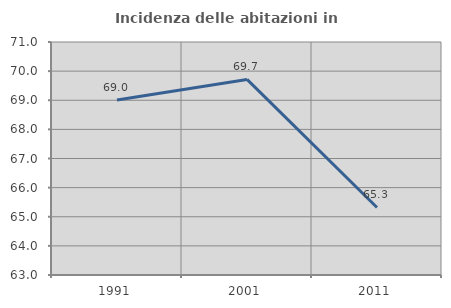
| Category | Incidenza delle abitazioni in proprietà  |
|---|---|
| 1991.0 | 69.007 |
| 2001.0 | 69.716 |
| 2011.0 | 65.319 |